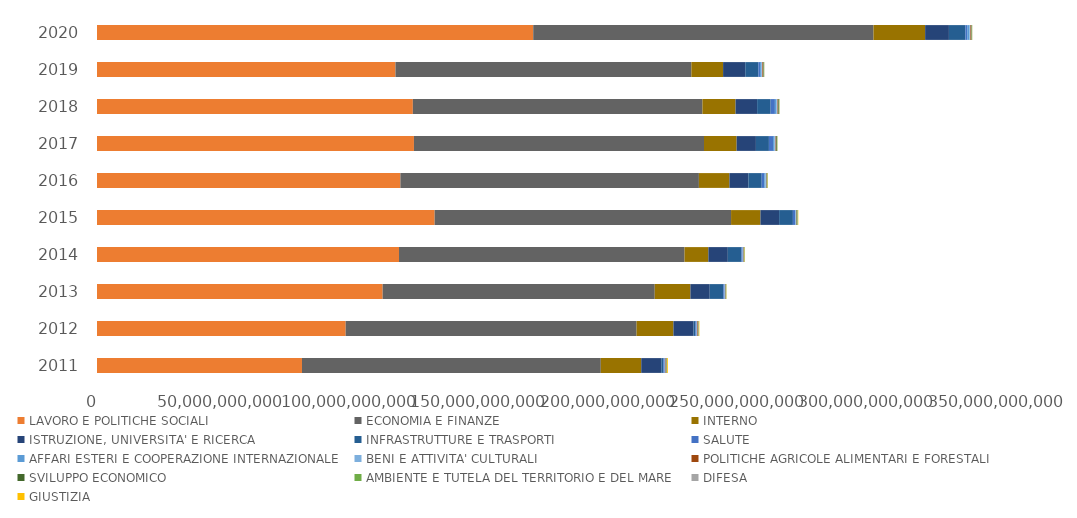
| Category | LAVORO E POLITICHE SOCIALI | ECONOMIA E FINANZE | INTERNO | ISTRUZIONE, UNIVERSITA' E RICERCA | INFRASTRUTTURE E TRASPORTI | SALUTE | AFFARI ESTERI E COOPERAZIONE INTERNAZIONALE | BENI E ATTIVITA' CULTURALI | POLITICHE AGRICOLE ALIMENTARI E FORESTALI | SVILUPPO ECONOMICO | AMBIENTE E TUTELA DEL TERRITORIO E DEL MARE | DIFESA | GIUSTIZIA |
|---|---|---|---|---|---|---|---|---|---|---|---|---|---|
| 2011.0 | 79274775216.03 | 115559914823.79 | 15647094596.11 | 7760412345.04 | 778164133.29 | 511717477.28 | 17173416.37 | 317780835.73 | 296695190 | 122938274.56 | 139650429.55 | 66843705.36 | 302091567 |
| 2012.0 | 96173665640.88 | 112490949506.98 | 14262855294.94 | 7782524470.71 | 678263984.96 | 482803818.18 | 16223182.19 | 304758652.37 | 294637932.49 | 119718713 | 138384639.96 | 47425855.8 | 171720129 |
| 2013.0 | 110470859415.06 | 105230520999.53 | 13792864862.67 | 7471936501.37 | 5244621892.83 | 461089931.08 | 17700481 | 297325390 | 147066578.3 | 96159365.41 | 141090301.23 | 44616495.75 | 77400115 |
| 2014.0 | 116802820292.76 | 110413431325.88 | 9222896206.17 | 7527260609.14 | 5248010301.87 | 451297526.32 | 17265022.09 | 340962859.24 | 152720365.26 | 127429341.82 | 154977165.65 | 41745598.63 | 111218594 |
| 2015.0 | 130576639097.13 | 114641971017.41 | 11359332404.29 | 7221801340.82 | 5329104198.07 | 934912690.99 | 18006171 | 333225051.21 | 145286918.23 | 287056145.33 | 170871852.62 | 61586757.6 | 132891992 |
| 2016.0 | 117337438449.83 | 115441933772.41 | 11811998849.28 | 7309419233.09 | 5168987953.02 | 975067531.35 | 470065832.21 | 349722117.67 | 134749236.64 | 175676162.49 | 184620380.62 | 47427865.56 | 88386138 |
| 2017.0 | 122575873650.91 | 112176677611.11 | 12611749383.35 | 7465828008.98 | 5023301344.22 | 1608498778.78 | 575554287.76 | 384394417.39 | 296339957.65 | 271842477.16 | 139130626.59 | 48748469.79 | 37504250.25 |
| 2018.0 | 122153449268.51 | 111996443568.71 | 12799789812.67 | 8346267834.79 | 5228936423.67 | 1648054029.91 | 618098607.79 | 388259054.3 | 302465360.55 | 248434570.29 | 154031881.29 | 101495469.71 | 55216406.2 |
| 2019.0 | 115429389259.58 | 114442200210.95 | 12264138241.67 | 8573197659.01 | 5076482920 | 657985791.82 | 542153325.36 | 333889898.56 | 333236312.52 | 194394086.3 | 162416667.96 | 83088554.57 | 20632054.61 |
| 2020.0 | 168707657082.82 | 131586229505.86 | 19978285089.49 | 9201199849.34 | 6370166442.45 | 726168254.69 | 825382033.72 | 374275224.89 | 358844844.71 | 134831721.12 | 186198311.12 | 54905192.85 | 22697312.9 |